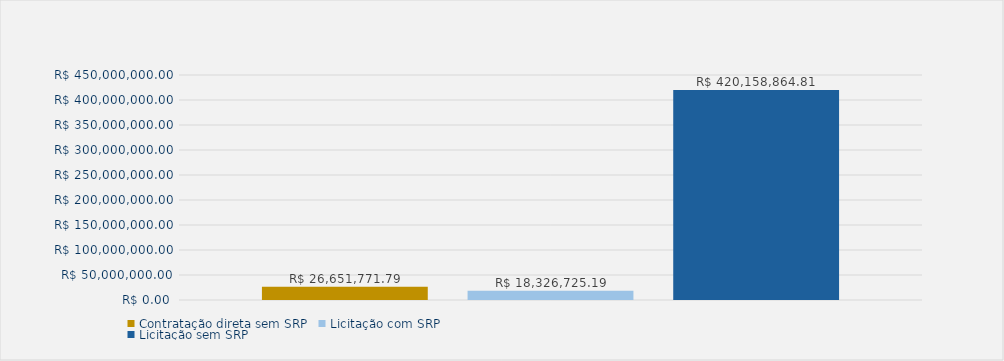
| Category | Contratação direta sem SRP | Licitação com SRP | Licitação sem SRP |
|---|---|---|---|
| Total | 26651771.79 | 18326725.19 | 420158864.81 |